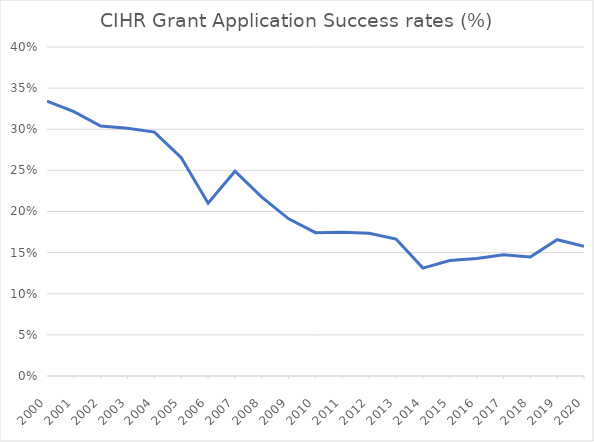
| Category | Success rate |
|---|---|
| 2000.0 | 0.334 |
| 2001.0 | 0.322 |
| 2002.0 | 0.304 |
| 2003.0 | 0.301 |
| 2004.0 | 0.297 |
| 2005.0 | 0.265 |
| 2006.0 | 0.21 |
| 2007.0 | 0.249 |
| 2008.0 | 0.217 |
| 2009.0 | 0.191 |
| 2010.0 | 0.174 |
| 2011.0 | 0.175 |
| 2012.0 | 0.173 |
| 2013.0 | 0.167 |
| 2014.0 | 0.131 |
| 2015.0 | 0.14 |
| 2016.0 | 0.143 |
| 2017.0 | 0.147 |
| 2018.0 | 0.145 |
| 2019.0 | 0.166 |
| 2020.0 | 0.158 |